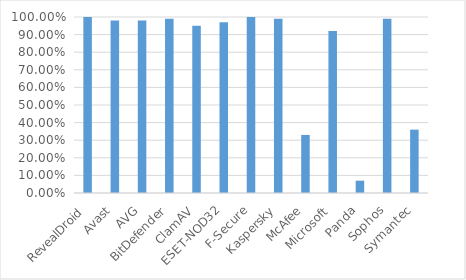
| Category | Series 0 |
|---|---|
| RevealDroid | 1 |
| Avast | 0.98 |
| AVG | 0.98 |
| BitDefender | 0.99 |
| ClamAV | 0.95 |
| ESET-NOD32 | 0.97 |
| F-Secure | 1 |
| Kaspersky | 0.99 |
| McAfee | 0.33 |
| Microsoft | 0.92 |
| Panda | 0.07 |
| Sophos | 0.99 |
| Symantec | 0.36 |